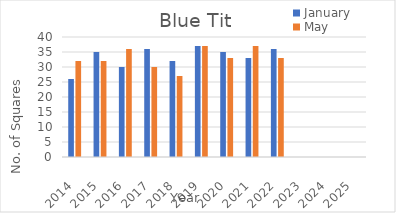
| Category | January | May |
|---|---|---|
| 2014.0 | 26 | 32 |
| 2015.0 | 35 | 32 |
| 2016.0 | 30 | 36 |
| 2017.0 | 36 | 30 |
| 2018.0 | 32 | 27 |
| 2019.0 | 37 | 37 |
| 2020.0 | 35 | 33 |
| 2021.0 | 33 | 37 |
| 2022.0 | 36 | 33 |
| 2023.0 | 0 | 0 |
| 2024.0 | 0 | 0 |
| 2025.0 | 0 | 0 |